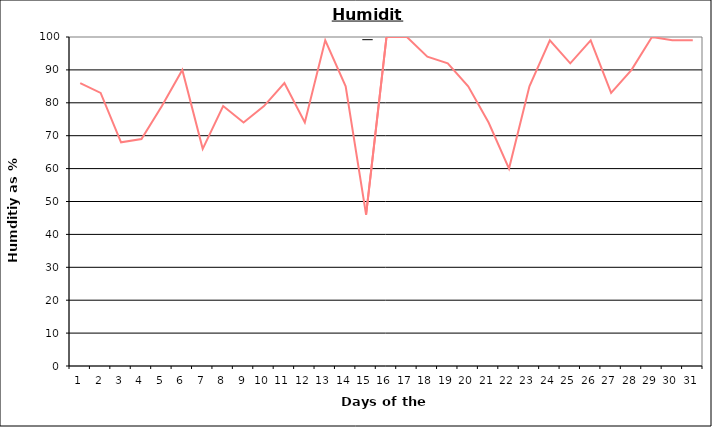
| Category | Series 0 |
|---|---|
| 0 | 86 |
| 1 | 83 |
| 2 | 68 |
| 3 | 69 |
| 4 | 79 |
| 5 | 90 |
| 6 | 66 |
| 7 | 79 |
| 8 | 74 |
| 9 | 79 |
| 10 | 86 |
| 11 | 74 |
| 12 | 99 |
| 13 | 85 |
| 14 | 46 |
| 15 | 100 |
| 16 | 100 |
| 17 | 94 |
| 18 | 92 |
| 19 | 85 |
| 20 | 74 |
| 21 | 60 |
| 22 | 85 |
| 23 | 99 |
| 24 | 92 |
| 25 | 99 |
| 26 | 83 |
| 27 | 90 |
| 28 | 100 |
| 29 | 99 |
| 30 | 99 |